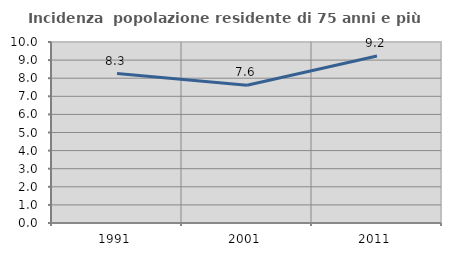
| Category | Incidenza  popolazione residente di 75 anni e più |
|---|---|
| 1991.0 | 8.259 |
| 2001.0 | 7.615 |
| 2011.0 | 9.228 |